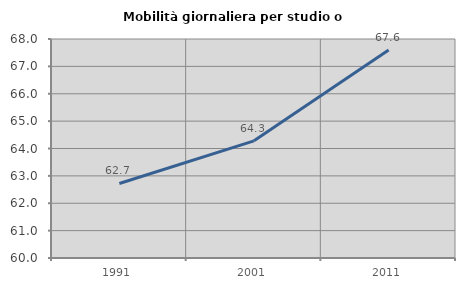
| Category | Mobilità giornaliera per studio o lavoro |
|---|---|
| 1991.0 | 62.723 |
| 2001.0 | 64.281 |
| 2011.0 | 67.598 |